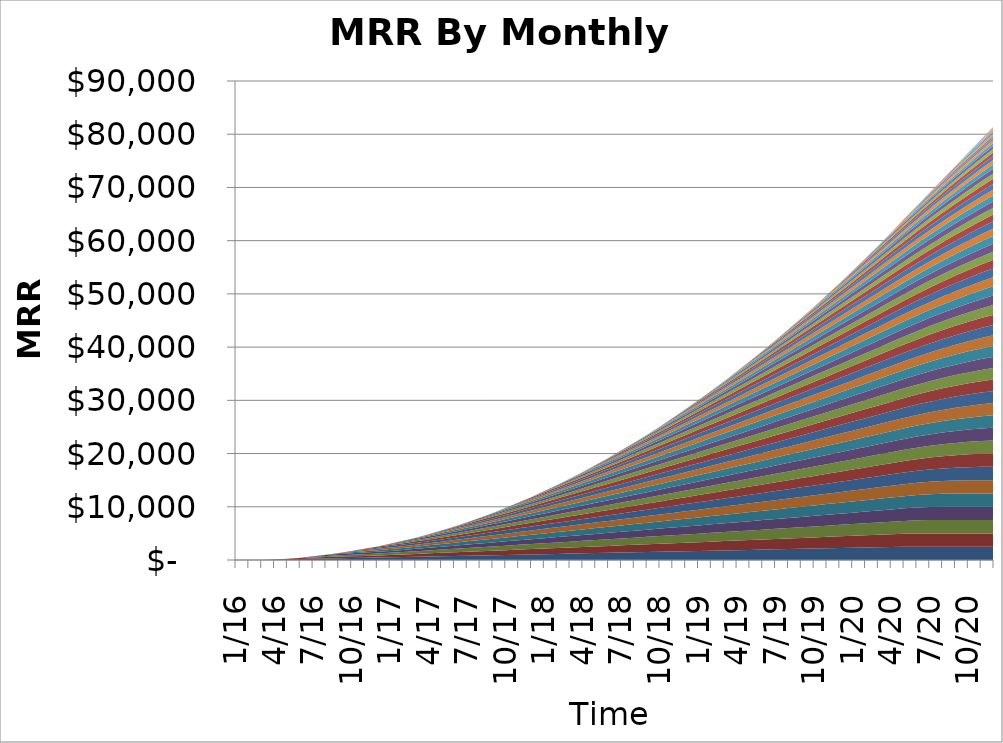
| Category | 1/1/16 | 2/1/16 | 3/1/16 | 4/1/16 | 5/1/16 | 6/1/16 | 7/1/16 | 8/1/16 | 9/1/16 | 10/1/16 | 11/1/16 | 12/1/16 | 1/1/17 | 2/1/17 | 3/1/17 | 4/1/17 | 5/1/17 | 6/1/17 | 7/1/17 | 8/1/17 | 9/1/17 | 10/1/17 | 11/1/17 | 12/1/17 | 1/1/18 | 2/1/18 | 3/1/18 | 4/1/18 | 5/1/18 | 6/1/18 | 7/1/18 | 8/1/18 | 9/1/18 | 10/1/18 | 11/1/18 | 12/1/18 | 1/1/19 | 2/1/19 | 3/1/19 | 4/1/19 | 5/1/19 | 6/1/19 | 7/1/19 | 8/1/19 | 9/1/19 | 10/1/19 | 11/1/19 | 12/1/19 | 1/1/20 | 2/1/20 | 3/1/20 | 4/1/20 | 5/1/20 | 6/1/20 | 7/1/20 | 8/1/20 | 9/1/20 | 10/1/20 | 11/1/20 | 12/1/20 | 1/1/21 | 2/1/21 | 3/1/21 | 4/1/21 | 5/1/21 | 6/1/21 | 7/1/21 | 8/1/21 | 9/1/21 | 10/1/21 | 11/1/21 | 12/1/21 | 1/1/22 | 2/1/22 | 3/1/22 | 4/1/22 | 5/1/22 | 6/1/22 | 7/1/22 | 8/1/22 | 9/1/22 | 10/1/22 | 11/1/22 | 12/1/22 |
|---|---|---|---|---|---|---|---|---|---|---|---|---|---|---|---|---|---|---|---|---|---|---|---|---|---|---|---|---|---|---|---|---|---|---|---|---|---|---|---|---|---|---|---|---|---|---|---|---|---|---|---|---|---|---|---|---|---|---|---|---|---|---|---|---|---|---|---|---|---|---|---|---|---|---|---|---|---|---|---|---|---|---|---|---|
| 2016-01-01 | 0 | 0 | 0 | 0 | 0 | 0 | 0 | 0 | 0 | 0 | 0 | 0 | 0 | 0 | 0 | 0 | 0 | 0 | 0 | 0 | 0 | 0 | 0 | 0 | 0 | 0 | 0 | 0 | 0 | 0 | 0 | 0 | 0 | 0 | 0 | 0 | 0 | 0 | 0 | 0 | 0 | 0 | 0 | 0 | 0 | 0 | 0 | 0 | 0 | 0 | 0 | 0 | 0 | 0 | 0 | 0 | 0 | 0 | 0 | 0 | 0 | 0 | 0 | 0 | 0 | 0 | 0 | 0 | 0 | 0 | 0 | 0 | 0 | 0 | 0 | 0 | 0 | 0 | 0 | 0 | 0 | 0 | 0 | 0 |
| 2016-02-01 | 0 | 0 | 0 | 0 | 0 | 0 | 0 | 0 | 0 | 0 | 0 | 0 | 0 | 0 | 0 | 0 | 0 | 0 | 0 | 0 | 0 | 0 | 0 | 0 | 0 | 0 | 0 | 0 | 0 | 0 | 0 | 0 | 0 | 0 | 0 | 0 | 0 | 0 | 0 | 0 | 0 | 0 | 0 | 0 | 0 | 0 | 0 | 0 | 0 | 0 | 0 | 0 | 0 | 0 | 0 | 0 | 0 | 0 | 0 | 0 | 0 | 0 | 0 | 0 | 0 | 0 | 0 | 0 | 0 | 0 | 0 | 0 | 0 | 0 | 0 | 0 | 0 | 0 | 0 | 0 | 0 | 0 | 0 | 0 |
| 2016-03-01 | 0 | 0 | 0 | 0 | 0 | 0 | 0 | 0 | 0 | 0 | 0 | 0 | 0 | 0 | 0 | 0 | 0 | 0 | 0 | 0 | 0 | 0 | 0 | 0 | 0 | 0 | 0 | 0 | 0 | 0 | 0 | 0 | 0 | 0 | 0 | 0 | 0 | 0 | 0 | 0 | 0 | 0 | 0 | 0 | 0 | 0 | 0 | 0 | 0 | 0 | 0 | 0 | 0 | 0 | 0 | 0 | 0 | 0 | 0 | 0 | 0 | 0 | 0 | 0 | 0 | 0 | 0 | 0 | 0 | 0 | 0 | 0 | 0 | 0 | 0 | 0 | 0 | 0 | 0 | 0 | 0 | 0 | 0 | 0 |
| 2016-04-01 | 80.436 | 0 | 0 | 0 | 0 | 0 | 0 | 0 | 0 | 0 | 0 | 0 | 0 | 0 | 0 | 0 | 0 | 0 | 0 | 0 | 0 | 0 | 0 | 0 | 0 | 0 | 0 | 0 | 0 | 0 | 0 | 0 | 0 | 0 | 0 | 0 | 0 | 0 | 0 | 0 | 0 | 0 | 0 | 0 | 0 | 0 | 0 | 0 | 0 | 0 | 0 | 0 | 0 | 0 | 0 | 0 | 0 | 0 | 0 | 0 | 0 | 0 | 0 | 0 | 0 | 0 | 0 | 0 | 0 | 0 | 0 | 0 | 0 | 0 | 0 | 0 | 0 | 0 | 0 | 0 | 0 | 0 | 0 | 0 |
| 2016-05-01 | 149.61 | 80.436 | 0 | 0 | 0 | 0 | 0 | 0 | 0 | 0 | 0 | 0 | 0 | 0 | 0 | 0 | 0 | 0 | 0 | 0 | 0 | 0 | 0 | 0 | 0 | 0 | 0 | 0 | 0 | 0 | 0 | 0 | 0 | 0 | 0 | 0 | 0 | 0 | 0 | 0 | 0 | 0 | 0 | 0 | 0 | 0 | 0 | 0 | 0 | 0 | 0 | 0 | 0 | 0 | 0 | 0 | 0 | 0 | 0 | 0 | 0 | 0 | 0 | 0 | 0 | 0 | 0 | 0 | 0 | 0 | 0 | 0 | 0 | 0 | 0 | 0 | 0 | 0 | 0 | 0 | 0 | 0 | 0 | 0 |
| 2016-06-01 | 208.707 | 149.61 | 80.436 | 0 | 0 | 0 | 0 | 0 | 0 | 0 | 0 | 0 | 0 | 0 | 0 | 0 | 0 | 0 | 0 | 0 | 0 | 0 | 0 | 0 | 0 | 0 | 0 | 0 | 0 | 0 | 0 | 0 | 0 | 0 | 0 | 0 | 0 | 0 | 0 | 0 | 0 | 0 | 0 | 0 | 0 | 0 | 0 | 0 | 0 | 0 | 0 | 0 | 0 | 0 | 0 | 0 | 0 | 0 | 0 | 0 | 0 | 0 | 0 | 0 | 0 | 0 | 0 | 0 | 0 | 0 | 0 | 0 | 0 | 0 | 0 | 0 | 0 | 0 | 0 | 0 | 0 | 0 | 0 | 0 |
| 2016-07-01 | 258.796 | 208.707 | 149.61 | 80.436 | 0 | 0 | 0 | 0 | 0 | 0 | 0 | 0 | 0 | 0 | 0 | 0 | 0 | 0 | 0 | 0 | 0 | 0 | 0 | 0 | 0 | 0 | 0 | 0 | 0 | 0 | 0 | 0 | 0 | 0 | 0 | 0 | 0 | 0 | 0 | 0 | 0 | 0 | 0 | 0 | 0 | 0 | 0 | 0 | 0 | 0 | 0 | 0 | 0 | 0 | 0 | 0 | 0 | 0 | 0 | 0 | 0 | 0 | 0 | 0 | 0 | 0 | 0 | 0 | 0 | 0 | 0 | 0 | 0 | 0 | 0 | 0 | 0 | 0 | 0 | 0 | 0 | 0 | 0 | 0 |
| 2016-08-01 | 300.85 | 258.796 | 208.707 | 149.61 | 80.436 | 0 | 0 | 0 | 0 | 0 | 0 | 0 | 0 | 0 | 0 | 0 | 0 | 0 | 0 | 0 | 0 | 0 | 0 | 0 | 0 | 0 | 0 | 0 | 0 | 0 | 0 | 0 | 0 | 0 | 0 | 0 | 0 | 0 | 0 | 0 | 0 | 0 | 0 | 0 | 0 | 0 | 0 | 0 | 0 | 0 | 0 | 0 | 0 | 0 | 0 | 0 | 0 | 0 | 0 | 0 | 0 | 0 | 0 | 0 | 0 | 0 | 0 | 0 | 0 | 0 | 0 | 0 | 0 | 0 | 0 | 0 | 0 | 0 | 0 | 0 | 0 | 0 | 0 | 0 |
| 2016-09-01 | 335.749 | 300.85 | 258.796 | 208.707 | 149.61 | 80.436 | 0 | 0 | 0 | 0 | 0 | 0 | 0 | 0 | 0 | 0 | 0 | 0 | 0 | 0 | 0 | 0 | 0 | 0 | 0 | 0 | 0 | 0 | 0 | 0 | 0 | 0 | 0 | 0 | 0 | 0 | 0 | 0 | 0 | 0 | 0 | 0 | 0 | 0 | 0 | 0 | 0 | 0 | 0 | 0 | 0 | 0 | 0 | 0 | 0 | 0 | 0 | 0 | 0 | 0 | 0 | 0 | 0 | 0 | 0 | 0 | 0 | 0 | 0 | 0 | 0 | 0 | 0 | 0 | 0 | 0 | 0 | 0 | 0 | 0 | 0 | 0 | 0 | 0 |
| 2016-10-01 | 364.288 | 335.749 | 300.85 | 258.796 | 208.707 | 149.61 | 80.436 | 0 | 0 | 0 | 0 | 0 | 0 | 0 | 0 | 0 | 0 | 0 | 0 | 0 | 0 | 0 | 0 | 0 | 0 | 0 | 0 | 0 | 0 | 0 | 0 | 0 | 0 | 0 | 0 | 0 | 0 | 0 | 0 | 0 | 0 | 0 | 0 | 0 | 0 | 0 | 0 | 0 | 0 | 0 | 0 | 0 | 0 | 0 | 0 | 0 | 0 | 0 | 0 | 0 | 0 | 0 | 0 | 0 | 0 | 0 | 0 | 0 | 0 | 0 | 0 | 0 | 0 | 0 | 0 | 0 | 0 | 0 | 0 | 0 | 0 | 0 | 0 | 0 |
| 2016-11-01 | 400 | 364.288 | 335.749 | 300.85 | 258.796 | 208.707 | 149.61 | 80.436 | 0 | 0 | 0 | 0 | 0 | 0 | 0 | 0 | 0 | 0 | 0 | 0 | 0 | 0 | 0 | 0 | 0 | 0 | 0 | 0 | 0 | 0 | 0 | 0 | 0 | 0 | 0 | 0 | 0 | 0 | 0 | 0 | 0 | 0 | 0 | 0 | 0 | 0 | 0 | 0 | 0 | 0 | 0 | 0 | 0 | 0 | 0 | 0 | 0 | 0 | 0 | 0 | 0 | 0 | 0 | 0 | 0 | 0 | 0 | 0 | 0 | 0 | 0 | 0 | 0 | 0 | 0 | 0 | 0 | 0 | 0 | 0 | 0 | 0 | 0 | 0 |
| 2016-12-01 | 450 | 400 | 364.288 | 335.749 | 300.85 | 258.796 | 208.707 | 149.61 | 80.436 | 0 | 0 | 0 | 0 | 0 | 0 | 0 | 0 | 0 | 0 | 0 | 0 | 0 | 0 | 0 | 0 | 0 | 0 | 0 | 0 | 0 | 0 | 0 | 0 | 0 | 0 | 0 | 0 | 0 | 0 | 0 | 0 | 0 | 0 | 0 | 0 | 0 | 0 | 0 | 0 | 0 | 0 | 0 | 0 | 0 | 0 | 0 | 0 | 0 | 0 | 0 | 0 | 0 | 0 | 0 | 0 | 0 | 0 | 0 | 0 | 0 | 0 | 0 | 0 | 0 | 0 | 0 | 0 | 0 | 0 | 0 | 0 | 0 | 0 | 0 |
| 2017-01-01 | 500 | 450 | 400 | 364.288 | 335.749 | 300.85 | 258.796 | 208.707 | 149.61 | 80.436 | 0 | 0 | 0 | 0 | 0 | 0 | 0 | 0 | 0 | 0 | 0 | 0 | 0 | 0 | 0 | 0 | 0 | 0 | 0 | 0 | 0 | 0 | 0 | 0 | 0 | 0 | 0 | 0 | 0 | 0 | 0 | 0 | 0 | 0 | 0 | 0 | 0 | 0 | 0 | 0 | 0 | 0 | 0 | 0 | 0 | 0 | 0 | 0 | 0 | 0 | 0 | 0 | 0 | 0 | 0 | 0 | 0 | 0 | 0 | 0 | 0 | 0 | 0 | 0 | 0 | 0 | 0 | 0 | 0 | 0 | 0 | 0 | 0 | 0 |
| 2017-02-01 | 550 | 500 | 450 | 400 | 364.288 | 335.749 | 300.85 | 258.796 | 208.707 | 149.61 | 80.436 | 0 | 0 | 0 | 0 | 0 | 0 | 0 | 0 | 0 | 0 | 0 | 0 | 0 | 0 | 0 | 0 | 0 | 0 | 0 | 0 | 0 | 0 | 0 | 0 | 0 | 0 | 0 | 0 | 0 | 0 | 0 | 0 | 0 | 0 | 0 | 0 | 0 | 0 | 0 | 0 | 0 | 0 | 0 | 0 | 0 | 0 | 0 | 0 | 0 | 0 | 0 | 0 | 0 | 0 | 0 | 0 | 0 | 0 | 0 | 0 | 0 | 0 | 0 | 0 | 0 | 0 | 0 | 0 | 0 | 0 | 0 | 0 | 0 |
| 2017-03-01 | 600 | 550 | 500 | 450 | 400 | 364.288 | 335.749 | 300.85 | 258.796 | 208.707 | 149.61 | 80.436 | 0 | 0 | 0 | 0 | 0 | 0 | 0 | 0 | 0 | 0 | 0 | 0 | 0 | 0 | 0 | 0 | 0 | 0 | 0 | 0 | 0 | 0 | 0 | 0 | 0 | 0 | 0 | 0 | 0 | 0 | 0 | 0 | 0 | 0 | 0 | 0 | 0 | 0 | 0 | 0 | 0 | 0 | 0 | 0 | 0 | 0 | 0 | 0 | 0 | 0 | 0 | 0 | 0 | 0 | 0 | 0 | 0 | 0 | 0 | 0 | 0 | 0 | 0 | 0 | 0 | 0 | 0 | 0 | 0 | 0 | 0 | 0 |
| 2017-04-01 | 650 | 600 | 550 | 500 | 450 | 400 | 364.288 | 335.749 | 300.85 | 258.796 | 208.707 | 149.61 | 80.436 | 0 | 0 | 0 | 0 | 0 | 0 | 0 | 0 | 0 | 0 | 0 | 0 | 0 | 0 | 0 | 0 | 0 | 0 | 0 | 0 | 0 | 0 | 0 | 0 | 0 | 0 | 0 | 0 | 0 | 0 | 0 | 0 | 0 | 0 | 0 | 0 | 0 | 0 | 0 | 0 | 0 | 0 | 0 | 0 | 0 | 0 | 0 | 0 | 0 | 0 | 0 | 0 | 0 | 0 | 0 | 0 | 0 | 0 | 0 | 0 | 0 | 0 | 0 | 0 | 0 | 0 | 0 | 0 | 0 | 0 | 0 |
| 2017-05-01 | 700 | 650 | 600 | 550 | 500 | 450 | 400 | 364.288 | 335.749 | 300.85 | 258.796 | 208.707 | 149.61 | 80.436 | 0 | 0 | 0 | 0 | 0 | 0 | 0 | 0 | 0 | 0 | 0 | 0 | 0 | 0 | 0 | 0 | 0 | 0 | 0 | 0 | 0 | 0 | 0 | 0 | 0 | 0 | 0 | 0 | 0 | 0 | 0 | 0 | 0 | 0 | 0 | 0 | 0 | 0 | 0 | 0 | 0 | 0 | 0 | 0 | 0 | 0 | 0 | 0 | 0 | 0 | 0 | 0 | 0 | 0 | 0 | 0 | 0 | 0 | 0 | 0 | 0 | 0 | 0 | 0 | 0 | 0 | 0 | 0 | 0 | 0 |
| 2017-06-01 | 750 | 700 | 650 | 600 | 550 | 500 | 450 | 400 | 364.288 | 335.749 | 300.85 | 258.796 | 208.707 | 149.61 | 80.436 | 0 | 0 | 0 | 0 | 0 | 0 | 0 | 0 | 0 | 0 | 0 | 0 | 0 | 0 | 0 | 0 | 0 | 0 | 0 | 0 | 0 | 0 | 0 | 0 | 0 | 0 | 0 | 0 | 0 | 0 | 0 | 0 | 0 | 0 | 0 | 0 | 0 | 0 | 0 | 0 | 0 | 0 | 0 | 0 | 0 | 0 | 0 | 0 | 0 | 0 | 0 | 0 | 0 | 0 | 0 | 0 | 0 | 0 | 0 | 0 | 0 | 0 | 0 | 0 | 0 | 0 | 0 | 0 | 0 |
| 2017-07-01 | 800 | 750 | 700 | 650 | 600 | 550 | 500 | 450 | 400 | 364.288 | 335.749 | 300.85 | 258.796 | 208.707 | 149.61 | 80.436 | 0 | 0 | 0 | 0 | 0 | 0 | 0 | 0 | 0 | 0 | 0 | 0 | 0 | 0 | 0 | 0 | 0 | 0 | 0 | 0 | 0 | 0 | 0 | 0 | 0 | 0 | 0 | 0 | 0 | 0 | 0 | 0 | 0 | 0 | 0 | 0 | 0 | 0 | 0 | 0 | 0 | 0 | 0 | 0 | 0 | 0 | 0 | 0 | 0 | 0 | 0 | 0 | 0 | 0 | 0 | 0 | 0 | 0 | 0 | 0 | 0 | 0 | 0 | 0 | 0 | 0 | 0 | 0 |
| 2017-08-01 | 850 | 800 | 750 | 700 | 650 | 600 | 550 | 500 | 450 | 400 | 364.288 | 335.749 | 300.85 | 258.796 | 208.707 | 149.61 | 80.436 | 0 | 0 | 0 | 0 | 0 | 0 | 0 | 0 | 0 | 0 | 0 | 0 | 0 | 0 | 0 | 0 | 0 | 0 | 0 | 0 | 0 | 0 | 0 | 0 | 0 | 0 | 0 | 0 | 0 | 0 | 0 | 0 | 0 | 0 | 0 | 0 | 0 | 0 | 0 | 0 | 0 | 0 | 0 | 0 | 0 | 0 | 0 | 0 | 0 | 0 | 0 | 0 | 0 | 0 | 0 | 0 | 0 | 0 | 0 | 0 | 0 | 0 | 0 | 0 | 0 | 0 | 0 |
| 2017-09-01 | 900 | 850 | 800 | 750 | 700 | 650 | 600 | 550 | 500 | 450 | 400 | 364.288 | 335.749 | 300.85 | 258.796 | 208.707 | 149.61 | 80.436 | 0 | 0 | 0 | 0 | 0 | 0 | 0 | 0 | 0 | 0 | 0 | 0 | 0 | 0 | 0 | 0 | 0 | 0 | 0 | 0 | 0 | 0 | 0 | 0 | 0 | 0 | 0 | 0 | 0 | 0 | 0 | 0 | 0 | 0 | 0 | 0 | 0 | 0 | 0 | 0 | 0 | 0 | 0 | 0 | 0 | 0 | 0 | 0 | 0 | 0 | 0 | 0 | 0 | 0 | 0 | 0 | 0 | 0 | 0 | 0 | 0 | 0 | 0 | 0 | 0 | 0 |
| 2017-10-01 | 950 | 900 | 850 | 800 | 750 | 700 | 650 | 600 | 550 | 500 | 450 | 400 | 364.288 | 335.749 | 300.85 | 258.796 | 208.707 | 149.61 | 80.436 | 0 | 0 | 0 | 0 | 0 | 0 | 0 | 0 | 0 | 0 | 0 | 0 | 0 | 0 | 0 | 0 | 0 | 0 | 0 | 0 | 0 | 0 | 0 | 0 | 0 | 0 | 0 | 0 | 0 | 0 | 0 | 0 | 0 | 0 | 0 | 0 | 0 | 0 | 0 | 0 | 0 | 0 | 0 | 0 | 0 | 0 | 0 | 0 | 0 | 0 | 0 | 0 | 0 | 0 | 0 | 0 | 0 | 0 | 0 | 0 | 0 | 0 | 0 | 0 | 0 |
| 2017-11-01 | 1000 | 950 | 900 | 850 | 800 | 750 | 700 | 650 | 600 | 550 | 500 | 450 | 400 | 364.288 | 335.749 | 300.85 | 258.796 | 208.707 | 149.61 | 80.436 | 0 | 0 | 0 | 0 | 0 | 0 | 0 | 0 | 0 | 0 | 0 | 0 | 0 | 0 | 0 | 0 | 0 | 0 | 0 | 0 | 0 | 0 | 0 | 0 | 0 | 0 | 0 | 0 | 0 | 0 | 0 | 0 | 0 | 0 | 0 | 0 | 0 | 0 | 0 | 0 | 0 | 0 | 0 | 0 | 0 | 0 | 0 | 0 | 0 | 0 | 0 | 0 | 0 | 0 | 0 | 0 | 0 | 0 | 0 | 0 | 0 | 0 | 0 | 0 |
| 2017-12-01 | 1050 | 1000 | 950 | 900 | 850 | 800 | 750 | 700 | 650 | 600 | 550 | 500 | 450 | 400 | 364.288 | 335.749 | 300.85 | 258.796 | 208.707 | 149.61 | 80.436 | 0 | 0 | 0 | 0 | 0 | 0 | 0 | 0 | 0 | 0 | 0 | 0 | 0 | 0 | 0 | 0 | 0 | 0 | 0 | 0 | 0 | 0 | 0 | 0 | 0 | 0 | 0 | 0 | 0 | 0 | 0 | 0 | 0 | 0 | 0 | 0 | 0 | 0 | 0 | 0 | 0 | 0 | 0 | 0 | 0 | 0 | 0 | 0 | 0 | 0 | 0 | 0 | 0 | 0 | 0 | 0 | 0 | 0 | 0 | 0 | 0 | 0 | 0 |
| 2018-01-01 | 1100 | 1050 | 1000 | 950 | 900 | 850 | 800 | 750 | 700 | 650 | 600 | 550 | 500 | 450 | 400 | 364.288 | 335.749 | 300.85 | 258.796 | 208.707 | 149.61 | 80.436 | 0 | 0 | 0 | 0 | 0 | 0 | 0 | 0 | 0 | 0 | 0 | 0 | 0 | 0 | 0 | 0 | 0 | 0 | 0 | 0 | 0 | 0 | 0 | 0 | 0 | 0 | 0 | 0 | 0 | 0 | 0 | 0 | 0 | 0 | 0 | 0 | 0 | 0 | 0 | 0 | 0 | 0 | 0 | 0 | 0 | 0 | 0 | 0 | 0 | 0 | 0 | 0 | 0 | 0 | 0 | 0 | 0 | 0 | 0 | 0 | 0 | 0 |
| 2018-02-01 | 1150 | 1100 | 1050 | 1000 | 950 | 900 | 850 | 800 | 750 | 700 | 650 | 600 | 550 | 500 | 450 | 400 | 364.288 | 335.749 | 300.85 | 258.796 | 208.707 | 149.61 | 80.436 | 0 | 0 | 0 | 0 | 0 | 0 | 0 | 0 | 0 | 0 | 0 | 0 | 0 | 0 | 0 | 0 | 0 | 0 | 0 | 0 | 0 | 0 | 0 | 0 | 0 | 0 | 0 | 0 | 0 | 0 | 0 | 0 | 0 | 0 | 0 | 0 | 0 | 0 | 0 | 0 | 0 | 0 | 0 | 0 | 0 | 0 | 0 | 0 | 0 | 0 | 0 | 0 | 0 | 0 | 0 | 0 | 0 | 0 | 0 | 0 | 0 |
| 2018-03-01 | 1200 | 1150 | 1100 | 1050 | 1000 | 950 | 900 | 850 | 800 | 750 | 700 | 650 | 600 | 550 | 500 | 450 | 400 | 364.288 | 335.749 | 300.85 | 258.796 | 208.707 | 149.61 | 80.436 | 0 | 0 | 0 | 0 | 0 | 0 | 0 | 0 | 0 | 0 | 0 | 0 | 0 | 0 | 0 | 0 | 0 | 0 | 0 | 0 | 0 | 0 | 0 | 0 | 0 | 0 | 0 | 0 | 0 | 0 | 0 | 0 | 0 | 0 | 0 | 0 | 0 | 0 | 0 | 0 | 0 | 0 | 0 | 0 | 0 | 0 | 0 | 0 | 0 | 0 | 0 | 0 | 0 | 0 | 0 | 0 | 0 | 0 | 0 | 0 |
| 2018-04-01 | 1250 | 1200 | 1150 | 1100 | 1050 | 1000 | 950 | 900 | 850 | 800 | 750 | 700 | 650 | 600 | 550 | 500 | 450 | 400 | 364.288 | 335.749 | 300.85 | 258.796 | 208.707 | 149.61 | 80.436 | 0 | 0 | 0 | 0 | 0 | 0 | 0 | 0 | 0 | 0 | 0 | 0 | 0 | 0 | 0 | 0 | 0 | 0 | 0 | 0 | 0 | 0 | 0 | 0 | 0 | 0 | 0 | 0 | 0 | 0 | 0 | 0 | 0 | 0 | 0 | 0 | 0 | 0 | 0 | 0 | 0 | 0 | 0 | 0 | 0 | 0 | 0 | 0 | 0 | 0 | 0 | 0 | 0 | 0 | 0 | 0 | 0 | 0 | 0 |
| 2018-05-01 | 1300 | 1250 | 1200 | 1150 | 1100 | 1050 | 1000 | 950 | 900 | 850 | 800 | 750 | 700 | 650 | 600 | 550 | 500 | 450 | 400 | 364.288 | 335.749 | 300.85 | 258.796 | 208.707 | 149.61 | 80.436 | 0 | 0 | 0 | 0 | 0 | 0 | 0 | 0 | 0 | 0 | 0 | 0 | 0 | 0 | 0 | 0 | 0 | 0 | 0 | 0 | 0 | 0 | 0 | 0 | 0 | 0 | 0 | 0 | 0 | 0 | 0 | 0 | 0 | 0 | 0 | 0 | 0 | 0 | 0 | 0 | 0 | 0 | 0 | 0 | 0 | 0 | 0 | 0 | 0 | 0 | 0 | 0 | 0 | 0 | 0 | 0 | 0 | 0 |
| 2018-06-01 | 1350 | 1300 | 1250 | 1200 | 1150 | 1100 | 1050 | 1000 | 950 | 900 | 850 | 800 | 750 | 700 | 650 | 600 | 550 | 500 | 450 | 400 | 364.288 | 335.749 | 300.85 | 258.796 | 208.707 | 149.61 | 80.436 | 0 | 0 | 0 | 0 | 0 | 0 | 0 | 0 | 0 | 0 | 0 | 0 | 0 | 0 | 0 | 0 | 0 | 0 | 0 | 0 | 0 | 0 | 0 | 0 | 0 | 0 | 0 | 0 | 0 | 0 | 0 | 0 | 0 | 0 | 0 | 0 | 0 | 0 | 0 | 0 | 0 | 0 | 0 | 0 | 0 | 0 | 0 | 0 | 0 | 0 | 0 | 0 | 0 | 0 | 0 | 0 | 0 |
| 2018-07-01 | 1400 | 1350 | 1300 | 1250 | 1200 | 1150 | 1100 | 1050 | 1000 | 950 | 900 | 850 | 800 | 750 | 700 | 650 | 600 | 550 | 500 | 450 | 400 | 364.288 | 335.749 | 300.85 | 258.796 | 208.707 | 149.61 | 80.436 | 0 | 0 | 0 | 0 | 0 | 0 | 0 | 0 | 0 | 0 | 0 | 0 | 0 | 0 | 0 | 0 | 0 | 0 | 0 | 0 | 0 | 0 | 0 | 0 | 0 | 0 | 0 | 0 | 0 | 0 | 0 | 0 | 0 | 0 | 0 | 0 | 0 | 0 | 0 | 0 | 0 | 0 | 0 | 0 | 0 | 0 | 0 | 0 | 0 | 0 | 0 | 0 | 0 | 0 | 0 | 0 |
| 2018-08-01 | 1450 | 1400 | 1350 | 1300 | 1250 | 1200 | 1150 | 1100 | 1050 | 1000 | 950 | 900 | 850 | 800 | 750 | 700 | 650 | 600 | 550 | 500 | 450 | 400 | 364.288 | 335.749 | 300.85 | 258.796 | 208.707 | 149.61 | 80.436 | 0 | 0 | 0 | 0 | 0 | 0 | 0 | 0 | 0 | 0 | 0 | 0 | 0 | 0 | 0 | 0 | 0 | 0 | 0 | 0 | 0 | 0 | 0 | 0 | 0 | 0 | 0 | 0 | 0 | 0 | 0 | 0 | 0 | 0 | 0 | 0 | 0 | 0 | 0 | 0 | 0 | 0 | 0 | 0 | 0 | 0 | 0 | 0 | 0 | 0 | 0 | 0 | 0 | 0 | 0 |
| 2018-09-01 | 1500 | 1450 | 1400 | 1350 | 1300 | 1250 | 1200 | 1150 | 1100 | 1050 | 1000 | 950 | 900 | 850 | 800 | 750 | 700 | 650 | 600 | 550 | 500 | 450 | 400 | 364.288 | 335.749 | 300.85 | 258.796 | 208.707 | 149.61 | 80.436 | 0 | 0 | 0 | 0 | 0 | 0 | 0 | 0 | 0 | 0 | 0 | 0 | 0 | 0 | 0 | 0 | 0 | 0 | 0 | 0 | 0 | 0 | 0 | 0 | 0 | 0 | 0 | 0 | 0 | 0 | 0 | 0 | 0 | 0 | 0 | 0 | 0 | 0 | 0 | 0 | 0 | 0 | 0 | 0 | 0 | 0 | 0 | 0 | 0 | 0 | 0 | 0 | 0 | 0 |
| 2018-10-01 | 1550 | 1500 | 1450 | 1400 | 1350 | 1300 | 1250 | 1200 | 1150 | 1100 | 1050 | 1000 | 950 | 900 | 850 | 800 | 750 | 700 | 650 | 600 | 550 | 500 | 450 | 400 | 364.288 | 335.749 | 300.85 | 258.796 | 208.707 | 149.61 | 80.436 | 0 | 0 | 0 | 0 | 0 | 0 | 0 | 0 | 0 | 0 | 0 | 0 | 0 | 0 | 0 | 0 | 0 | 0 | 0 | 0 | 0 | 0 | 0 | 0 | 0 | 0 | 0 | 0 | 0 | 0 | 0 | 0 | 0 | 0 | 0 | 0 | 0 | 0 | 0 | 0 | 0 | 0 | 0 | 0 | 0 | 0 | 0 | 0 | 0 | 0 | 0 | 0 | 0 |
| 2018-11-01 | 1600 | 1550 | 1500 | 1450 | 1400 | 1350 | 1300 | 1250 | 1200 | 1150 | 1100 | 1050 | 1000 | 950 | 900 | 850 | 800 | 750 | 700 | 650 | 600 | 550 | 500 | 450 | 400 | 364.288 | 335.749 | 300.85 | 258.796 | 208.707 | 149.61 | 80.436 | 0 | 0 | 0 | 0 | 0 | 0 | 0 | 0 | 0 | 0 | 0 | 0 | 0 | 0 | 0 | 0 | 0 | 0 | 0 | 0 | 0 | 0 | 0 | 0 | 0 | 0 | 0 | 0 | 0 | 0 | 0 | 0 | 0 | 0 | 0 | 0 | 0 | 0 | 0 | 0 | 0 | 0 | 0 | 0 | 0 | 0 | 0 | 0 | 0 | 0 | 0 | 0 |
| 2018-12-01 | 1650 | 1600 | 1550 | 1500 | 1450 | 1400 | 1350 | 1300 | 1250 | 1200 | 1150 | 1100 | 1050 | 1000 | 950 | 900 | 850 | 800 | 750 | 700 | 650 | 600 | 550 | 500 | 450 | 400 | 364.288 | 335.749 | 300.85 | 258.796 | 208.707 | 149.61 | 80.436 | 0 | 0 | 0 | 0 | 0 | 0 | 0 | 0 | 0 | 0 | 0 | 0 | 0 | 0 | 0 | 0 | 0 | 0 | 0 | 0 | 0 | 0 | 0 | 0 | 0 | 0 | 0 | 0 | 0 | 0 | 0 | 0 | 0 | 0 | 0 | 0 | 0 | 0 | 0 | 0 | 0 | 0 | 0 | 0 | 0 | 0 | 0 | 0 | 0 | 0 | 0 |
| 2019-01-01 | 1700 | 1650 | 1600 | 1550 | 1500 | 1450 | 1400 | 1350 | 1300 | 1250 | 1200 | 1150 | 1100 | 1050 | 1000 | 950 | 900 | 850 | 800 | 750 | 700 | 650 | 600 | 550 | 500 | 450 | 400 | 364.288 | 335.749 | 300.85 | 258.796 | 208.707 | 149.61 | 80.436 | 0 | 0 | 0 | 0 | 0 | 0 | 0 | 0 | 0 | 0 | 0 | 0 | 0 | 0 | 0 | 0 | 0 | 0 | 0 | 0 | 0 | 0 | 0 | 0 | 0 | 0 | 0 | 0 | 0 | 0 | 0 | 0 | 0 | 0 | 0 | 0 | 0 | 0 | 0 | 0 | 0 | 0 | 0 | 0 | 0 | 0 | 0 | 0 | 0 | 0 |
| 2019-02-01 | 1750 | 1700 | 1650 | 1600 | 1550 | 1500 | 1450 | 1400 | 1350 | 1300 | 1250 | 1200 | 1150 | 1100 | 1050 | 1000 | 950 | 900 | 850 | 800 | 750 | 700 | 650 | 600 | 550 | 500 | 450 | 400 | 364.288 | 335.749 | 300.85 | 258.796 | 208.707 | 149.61 | 80.436 | 0 | 0 | 0 | 0 | 0 | 0 | 0 | 0 | 0 | 0 | 0 | 0 | 0 | 0 | 0 | 0 | 0 | 0 | 0 | 0 | 0 | 0 | 0 | 0 | 0 | 0 | 0 | 0 | 0 | 0 | 0 | 0 | 0 | 0 | 0 | 0 | 0 | 0 | 0 | 0 | 0 | 0 | 0 | 0 | 0 | 0 | 0 | 0 | 0 |
| 2019-03-01 | 1800 | 1750 | 1700 | 1650 | 1600 | 1550 | 1500 | 1450 | 1400 | 1350 | 1300 | 1250 | 1200 | 1150 | 1100 | 1050 | 1000 | 950 | 900 | 850 | 800 | 750 | 700 | 650 | 600 | 550 | 500 | 450 | 400 | 364.288 | 335.749 | 300.85 | 258.796 | 208.707 | 149.61 | 80.436 | 0 | 0 | 0 | 0 | 0 | 0 | 0 | 0 | 0 | 0 | 0 | 0 | 0 | 0 | 0 | 0 | 0 | 0 | 0 | 0 | 0 | 0 | 0 | 0 | 0 | 0 | 0 | 0 | 0 | 0 | 0 | 0 | 0 | 0 | 0 | 0 | 0 | 0 | 0 | 0 | 0 | 0 | 0 | 0 | 0 | 0 | 0 | 0 |
| 2019-04-01 | 1850 | 1800 | 1750 | 1700 | 1650 | 1600 | 1550 | 1500 | 1450 | 1400 | 1350 | 1300 | 1250 | 1200 | 1150 | 1100 | 1050 | 1000 | 950 | 900 | 850 | 800 | 750 | 700 | 650 | 600 | 550 | 500 | 450 | 400 | 364.288 | 335.749 | 300.85 | 258.796 | 208.707 | 149.61 | 80.436 | 0 | 0 | 0 | 0 | 0 | 0 | 0 | 0 | 0 | 0 | 0 | 0 | 0 | 0 | 0 | 0 | 0 | 0 | 0 | 0 | 0 | 0 | 0 | 0 | 0 | 0 | 0 | 0 | 0 | 0 | 0 | 0 | 0 | 0 | 0 | 0 | 0 | 0 | 0 | 0 | 0 | 0 | 0 | 0 | 0 | 0 | 0 |
| 2019-05-01 | 1900 | 1850 | 1800 | 1750 | 1700 | 1650 | 1600 | 1550 | 1500 | 1450 | 1400 | 1350 | 1300 | 1250 | 1200 | 1150 | 1100 | 1050 | 1000 | 950 | 900 | 850 | 800 | 750 | 700 | 650 | 600 | 550 | 500 | 450 | 400 | 364.288 | 335.749 | 300.85 | 258.796 | 208.707 | 149.61 | 80.436 | 0 | 0 | 0 | 0 | 0 | 0 | 0 | 0 | 0 | 0 | 0 | 0 | 0 | 0 | 0 | 0 | 0 | 0 | 0 | 0 | 0 | 0 | 0 | 0 | 0 | 0 | 0 | 0 | 0 | 0 | 0 | 0 | 0 | 0 | 0 | 0 | 0 | 0 | 0 | 0 | 0 | 0 | 0 | 0 | 0 | 0 |
| 2019-06-01 | 1950 | 1900 | 1850 | 1800 | 1750 | 1700 | 1650 | 1600 | 1550 | 1500 | 1450 | 1400 | 1350 | 1300 | 1250 | 1200 | 1150 | 1100 | 1050 | 1000 | 950 | 900 | 850 | 800 | 750 | 700 | 650 | 600 | 550 | 500 | 450 | 400 | 364.288 | 335.749 | 300.85 | 258.796 | 208.707 | 149.61 | 80.436 | 0 | 0 | 0 | 0 | 0 | 0 | 0 | 0 | 0 | 0 | 0 | 0 | 0 | 0 | 0 | 0 | 0 | 0 | 0 | 0 | 0 | 0 | 0 | 0 | 0 | 0 | 0 | 0 | 0 | 0 | 0 | 0 | 0 | 0 | 0 | 0 | 0 | 0 | 0 | 0 | 0 | 0 | 0 | 0 | 0 |
| 2019-07-01 | 2000 | 1950 | 1900 | 1850 | 1800 | 1750 | 1700 | 1650 | 1600 | 1550 | 1500 | 1450 | 1400 | 1350 | 1300 | 1250 | 1200 | 1150 | 1100 | 1050 | 1000 | 950 | 900 | 850 | 800 | 750 | 700 | 650 | 600 | 550 | 500 | 450 | 400 | 364.288 | 335.749 | 300.85 | 258.796 | 208.707 | 149.61 | 80.436 | 0 | 0 | 0 | 0 | 0 | 0 | 0 | 0 | 0 | 0 | 0 | 0 | 0 | 0 | 0 | 0 | 0 | 0 | 0 | 0 | 0 | 0 | 0 | 0 | 0 | 0 | 0 | 0 | 0 | 0 | 0 | 0 | 0 | 0 | 0 | 0 | 0 | 0 | 0 | 0 | 0 | 0 | 0 | 0 |
| 2019-08-01 | 2050 | 2000 | 1950 | 1900 | 1850 | 1800 | 1750 | 1700 | 1650 | 1600 | 1550 | 1500 | 1450 | 1400 | 1350 | 1300 | 1250 | 1200 | 1150 | 1100 | 1050 | 1000 | 950 | 900 | 850 | 800 | 750 | 700 | 650 | 600 | 550 | 500 | 450 | 400 | 364.288 | 335.749 | 300.85 | 258.796 | 208.707 | 149.61 | 80.436 | 0 | 0 | 0 | 0 | 0 | 0 | 0 | 0 | 0 | 0 | 0 | 0 | 0 | 0 | 0 | 0 | 0 | 0 | 0 | 0 | 0 | 0 | 0 | 0 | 0 | 0 | 0 | 0 | 0 | 0 | 0 | 0 | 0 | 0 | 0 | 0 | 0 | 0 | 0 | 0 | 0 | 0 | 0 |
| 2019-09-01 | 2100 | 2050 | 2000 | 1950 | 1900 | 1850 | 1800 | 1750 | 1700 | 1650 | 1600 | 1550 | 1500 | 1450 | 1400 | 1350 | 1300 | 1250 | 1200 | 1150 | 1100 | 1050 | 1000 | 950 | 900 | 850 | 800 | 750 | 700 | 650 | 600 | 550 | 500 | 450 | 400 | 364.288 | 335.749 | 300.85 | 258.796 | 208.707 | 149.61 | 80.436 | 0 | 0 | 0 | 0 | 0 | 0 | 0 | 0 | 0 | 0 | 0 | 0 | 0 | 0 | 0 | 0 | 0 | 0 | 0 | 0 | 0 | 0 | 0 | 0 | 0 | 0 | 0 | 0 | 0 | 0 | 0 | 0 | 0 | 0 | 0 | 0 | 0 | 0 | 0 | 0 | 0 | 0 |
| 2019-10-01 | 2150 | 2100 | 2050 | 2000 | 1950 | 1900 | 1850 | 1800 | 1750 | 1700 | 1650 | 1600 | 1550 | 1500 | 1450 | 1400 | 1350 | 1300 | 1250 | 1200 | 1150 | 1100 | 1050 | 1000 | 950 | 900 | 850 | 800 | 750 | 700 | 650 | 600 | 550 | 500 | 450 | 400 | 364.288 | 335.749 | 300.85 | 258.796 | 208.707 | 149.61 | 80.436 | 0 | 0 | 0 | 0 | 0 | 0 | 0 | 0 | 0 | 0 | 0 | 0 | 0 | 0 | 0 | 0 | 0 | 0 | 0 | 0 | 0 | 0 | 0 | 0 | 0 | 0 | 0 | 0 | 0 | 0 | 0 | 0 | 0 | 0 | 0 | 0 | 0 | 0 | 0 | 0 | 0 |
| 2019-11-01 | 2200 | 2150 | 2100 | 2050 | 2000 | 1950 | 1900 | 1850 | 1800 | 1750 | 1700 | 1650 | 1600 | 1550 | 1500 | 1450 | 1400 | 1350 | 1300 | 1250 | 1200 | 1150 | 1100 | 1050 | 1000 | 950 | 900 | 850 | 800 | 750 | 700 | 650 | 600 | 550 | 500 | 450 | 400 | 364.288 | 335.749 | 300.85 | 258.796 | 208.707 | 149.61 | 80.436 | 0 | 0 | 0 | 0 | 0 | 0 | 0 | 0 | 0 | 0 | 0 | 0 | 0 | 0 | 0 | 0 | 0 | 0 | 0 | 0 | 0 | 0 | 0 | 0 | 0 | 0 | 0 | 0 | 0 | 0 | 0 | 0 | 0 | 0 | 0 | 0 | 0 | 0 | 0 | 0 |
| 2019-12-01 | 2250 | 2200 | 2150 | 2100 | 2050 | 2000 | 1950 | 1900 | 1850 | 1800 | 1750 | 1700 | 1650 | 1600 | 1550 | 1500 | 1450 | 1400 | 1350 | 1300 | 1250 | 1200 | 1150 | 1100 | 1050 | 1000 | 950 | 900 | 850 | 800 | 750 | 700 | 650 | 600 | 550 | 500 | 450 | 400 | 364.288 | 335.749 | 300.85 | 258.796 | 208.707 | 149.61 | 80.436 | 0 | 0 | 0 | 0 | 0 | 0 | 0 | 0 | 0 | 0 | 0 | 0 | 0 | 0 | 0 | 0 | 0 | 0 | 0 | 0 | 0 | 0 | 0 | 0 | 0 | 0 | 0 | 0 | 0 | 0 | 0 | 0 | 0 | 0 | 0 | 0 | 0 | 0 | 0 |
| 2020-01-01 | 2300 | 2250 | 2200 | 2150 | 2100 | 2050 | 2000 | 1950 | 1900 | 1850 | 1800 | 1750 | 1700 | 1650 | 1600 | 1550 | 1500 | 1450 | 1400 | 1350 | 1300 | 1250 | 1200 | 1150 | 1100 | 1050 | 1000 | 950 | 900 | 850 | 800 | 750 | 700 | 650 | 600 | 550 | 500 | 450 | 400 | 364.288 | 335.749 | 300.85 | 258.796 | 208.707 | 149.61 | 80.436 | 0 | 0 | 0 | 0 | 0 | 0 | 0 | 0 | 0 | 0 | 0 | 0 | 0 | 0 | 0 | 0 | 0 | 0 | 0 | 0 | 0 | 0 | 0 | 0 | 0 | 0 | 0 | 0 | 0 | 0 | 0 | 0 | 0 | 0 | 0 | 0 | 0 | 0 |
| 2020-02-01 | 2350 | 2300 | 2250 | 2200 | 2150 | 2100 | 2050 | 2000 | 1950 | 1900 | 1850 | 1800 | 1750 | 1700 | 1650 | 1600 | 1550 | 1500 | 1450 | 1400 | 1350 | 1300 | 1250 | 1200 | 1150 | 1100 | 1050 | 1000 | 950 | 900 | 850 | 800 | 750 | 700 | 650 | 600 | 550 | 500 | 450 | 400 | 364.288 | 335.749 | 300.85 | 258.796 | 208.707 | 149.61 | 80.436 | 0 | 0 | 0 | 0 | 0 | 0 | 0 | 0 | 0 | 0 | 0 | 0 | 0 | 0 | 0 | 0 | 0 | 0 | 0 | 0 | 0 | 0 | 0 | 0 | 0 | 0 | 0 | 0 | 0 | 0 | 0 | 0 | 0 | 0 | 0 | 0 | 0 |
| 2020-03-01 | 2400 | 2350 | 2300 | 2250 | 2200 | 2150 | 2100 | 2050 | 2000 | 1950 | 1900 | 1850 | 1800 | 1750 | 1700 | 1650 | 1600 | 1550 | 1500 | 1450 | 1400 | 1350 | 1300 | 1250 | 1200 | 1150 | 1100 | 1050 | 1000 | 950 | 900 | 850 | 800 | 750 | 700 | 650 | 600 | 550 | 500 | 450 | 400 | 364.288 | 335.749 | 300.85 | 258.796 | 208.707 | 149.61 | 80.436 | 0 | 0 | 0 | 0 | 0 | 0 | 0 | 0 | 0 | 0 | 0 | 0 | 0 | 0 | 0 | 0 | 0 | 0 | 0 | 0 | 0 | 0 | 0 | 0 | 0 | 0 | 0 | 0 | 0 | 0 | 0 | 0 | 0 | 0 | 0 | 0 |
| 2020-04-01 | 2450 | 2400 | 2350 | 2300 | 2250 | 2200 | 2150 | 2100 | 2050 | 2000 | 1950 | 1900 | 1850 | 1800 | 1750 | 1700 | 1650 | 1600 | 1550 | 1500 | 1450 | 1400 | 1350 | 1300 | 1250 | 1200 | 1150 | 1100 | 1050 | 1000 | 950 | 900 | 850 | 800 | 750 | 700 | 650 | 600 | 550 | 500 | 450 | 400 | 364.288 | 335.749 | 300.85 | 258.796 | 208.707 | 149.61 | 80.436 | 0 | 0 | 0 | 0 | 0 | 0 | 0 | 0 | 0 | 0 | 0 | 0 | 0 | 0 | 0 | 0 | 0 | 0 | 0 | 0 | 0 | 0 | 0 | 0 | 0 | 0 | 0 | 0 | 0 | 0 | 0 | 0 | 0 | 0 | 0 |
| 2020-05-01 | 2500 | 2450 | 2400 | 2350 | 2300 | 2250 | 2200 | 2150 | 2100 | 2050 | 2000 | 1950 | 1900 | 1850 | 1800 | 1750 | 1700 | 1650 | 1600 | 1550 | 1500 | 1450 | 1400 | 1350 | 1300 | 1250 | 1200 | 1150 | 1100 | 1050 | 1000 | 950 | 900 | 850 | 800 | 750 | 700 | 650 | 600 | 550 | 500 | 450 | 400 | 364.288 | 335.749 | 300.85 | 258.796 | 208.707 | 149.61 | 80.436 | 0 | 0 | 0 | 0 | 0 | 0 | 0 | 0 | 0 | 0 | 0 | 0 | 0 | 0 | 0 | 0 | 0 | 0 | 0 | 0 | 0 | 0 | 0 | 0 | 0 | 0 | 0 | 0 | 0 | 0 | 0 | 0 | 0 | 0 |
| 2020-06-01 | 2500 | 2500 | 2450 | 2400 | 2350 | 2300 | 2250 | 2200 | 2150 | 2100 | 2050 | 2000 | 1950 | 1900 | 1850 | 1800 | 1750 | 1700 | 1650 | 1600 | 1550 | 1500 | 1450 | 1400 | 1350 | 1300 | 1250 | 1200 | 1150 | 1100 | 1050 | 1000 | 950 | 900 | 850 | 800 | 750 | 700 | 650 | 600 | 550 | 500 | 450 | 400 | 364.288 | 335.749 | 300.85 | 258.796 | 208.707 | 149.61 | 80.436 | 0 | 0 | 0 | 0 | 0 | 0 | 0 | 0 | 0 | 0 | 0 | 0 | 0 | 0 | 0 | 0 | 0 | 0 | 0 | 0 | 0 | 0 | 0 | 0 | 0 | 0 | 0 | 0 | 0 | 0 | 0 | 0 | 0 |
| 2020-07-01 | 2500 | 2500 | 2500 | 2450 | 2400 | 2350 | 2300 | 2250 | 2200 | 2150 | 2100 | 2050 | 2000 | 1950 | 1900 | 1850 | 1800 | 1750 | 1700 | 1650 | 1600 | 1550 | 1500 | 1450 | 1400 | 1350 | 1300 | 1250 | 1200 | 1150 | 1100 | 1050 | 1000 | 950 | 900 | 850 | 800 | 750 | 700 | 650 | 600 | 550 | 500 | 450 | 400 | 364.288 | 335.749 | 300.85 | 258.796 | 208.707 | 149.61 | 80.436 | 0 | 0 | 0 | 0 | 0 | 0 | 0 | 0 | 0 | 0 | 0 | 0 | 0 | 0 | 0 | 0 | 0 | 0 | 0 | 0 | 0 | 0 | 0 | 0 | 0 | 0 | 0 | 0 | 0 | 0 | 0 | 0 |
| 2020-08-01 | 2500 | 2500 | 2500 | 2500 | 2450 | 2400 | 2350 | 2300 | 2250 | 2200 | 2150 | 2100 | 2050 | 2000 | 1950 | 1900 | 1850 | 1800 | 1750 | 1700 | 1650 | 1600 | 1550 | 1500 | 1450 | 1400 | 1350 | 1300 | 1250 | 1200 | 1150 | 1100 | 1050 | 1000 | 950 | 900 | 850 | 800 | 750 | 700 | 650 | 600 | 550 | 500 | 450 | 400 | 364.288 | 335.749 | 300.85 | 258.796 | 208.707 | 149.61 | 80.436 | 0 | 0 | 0 | 0 | 0 | 0 | 0 | 0 | 0 | 0 | 0 | 0 | 0 | 0 | 0 | 0 | 0 | 0 | 0 | 0 | 0 | 0 | 0 | 0 | 0 | 0 | 0 | 0 | 0 | 0 | 0 |
| 2020-09-01 | 2500 | 2500 | 2500 | 2500 | 2500 | 2450 | 2400 | 2350 | 2300 | 2250 | 2200 | 2150 | 2100 | 2050 | 2000 | 1950 | 1900 | 1850 | 1800 | 1750 | 1700 | 1650 | 1600 | 1550 | 1500 | 1450 | 1400 | 1350 | 1300 | 1250 | 1200 | 1150 | 1100 | 1050 | 1000 | 950 | 900 | 850 | 800 | 750 | 700 | 650 | 600 | 550 | 500 | 450 | 400 | 364.288 | 335.749 | 300.85 | 258.796 | 208.707 | 149.61 | 80.436 | 0 | 0 | 0 | 0 | 0 | 0 | 0 | 0 | 0 | 0 | 0 | 0 | 0 | 0 | 0 | 0 | 0 | 0 | 0 | 0 | 0 | 0 | 0 | 0 | 0 | 0 | 0 | 0 | 0 | 0 |
| 2020-10-01 | 2500 | 2500 | 2500 | 2500 | 2500 | 2500 | 2450 | 2400 | 2350 | 2300 | 2250 | 2200 | 2150 | 2100 | 2050 | 2000 | 1950 | 1900 | 1850 | 1800 | 1750 | 1700 | 1650 | 1600 | 1550 | 1500 | 1450 | 1400 | 1350 | 1300 | 1250 | 1200 | 1150 | 1100 | 1050 | 1000 | 950 | 900 | 850 | 800 | 750 | 700 | 650 | 600 | 550 | 500 | 450 | 400 | 364.288 | 335.749 | 300.85 | 258.796 | 208.707 | 149.61 | 80.436 | 0 | 0 | 0 | 0 | 0 | 0 | 0 | 0 | 0 | 0 | 0 | 0 | 0 | 0 | 0 | 0 | 0 | 0 | 0 | 0 | 0 | 0 | 0 | 0 | 0 | 0 | 0 | 0 | 0 |
| 2020-11-01 | 2500 | 2500 | 2500 | 2500 | 2500 | 2500 | 2500 | 2450 | 2400 | 2350 | 2300 | 2250 | 2200 | 2150 | 2100 | 2050 | 2000 | 1950 | 1900 | 1850 | 1800 | 1750 | 1700 | 1650 | 1600 | 1550 | 1500 | 1450 | 1400 | 1350 | 1300 | 1250 | 1200 | 1150 | 1100 | 1050 | 1000 | 950 | 900 | 850 | 800 | 750 | 700 | 650 | 600 | 550 | 500 | 450 | 400 | 364.288 | 335.749 | 300.85 | 258.796 | 208.707 | 149.61 | 80.436 | 0 | 0 | 0 | 0 | 0 | 0 | 0 | 0 | 0 | 0 | 0 | 0 | 0 | 0 | 0 | 0 | 0 | 0 | 0 | 0 | 0 | 0 | 0 | 0 | 0 | 0 | 0 | 0 |
| 2020-12-01 | 2500 | 2500 | 2500 | 2500 | 2500 | 2500 | 2500 | 2500 | 2450 | 2400 | 2350 | 2300 | 2250 | 2200 | 2150 | 2100 | 2050 | 2000 | 1950 | 1900 | 1850 | 1800 | 1750 | 1700 | 1650 | 1600 | 1550 | 1500 | 1450 | 1400 | 1350 | 1300 | 1250 | 1200 | 1150 | 1100 | 1050 | 1000 | 950 | 900 | 850 | 800 | 750 | 700 | 650 | 600 | 550 | 500 | 450 | 400 | 364.288 | 335.749 | 300.85 | 258.796 | 208.707 | 149.61 | 80.436 | 0 | 0 | 0 | 0 | 0 | 0 | 0 | 0 | 0 | 0 | 0 | 0 | 0 | 0 | 0 | 0 | 0 | 0 | 0 | 0 | 0 | 0 | 0 | 0 | 0 | 0 | 0 |